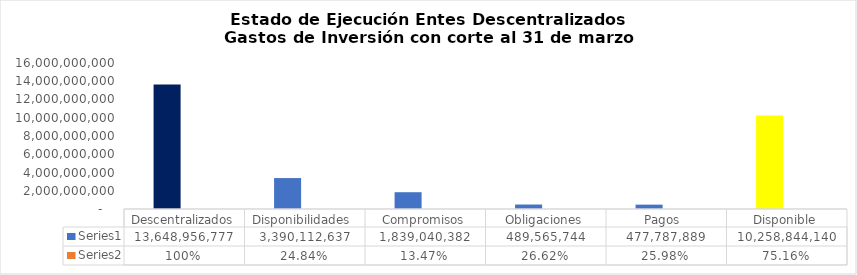
| Category | Series 0 | Series 1 |
|---|---|---|
| Descentralizados | 13648956777.16 | 1 |
| Disponibilidades  | 3390112636.87 | 0.248 |
| Compromisos | 1839040381.87 | 0.135 |
| Obligaciones | 489565743.89 | 0.266 |
| Pagos  | 477787888.89 | 0.26 |
| Disponible | 10258844140.29 | 0.752 |